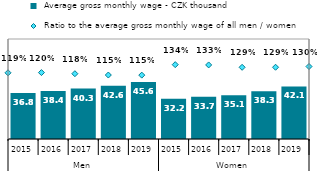
| Category |  Average gross monthly wage - CZK thousand |
|---|---|
| 0 | 36.759 |
| 1 | 38.417 |
| 2 | 40.307 |
| 3 | 42.616 |
| 4 | 45.644 |
| 5 | 32.241 |
| 6 | 33.702 |
| 7 | 35.084 |
| 8 | 38.269 |
| 9 | 42.068 |